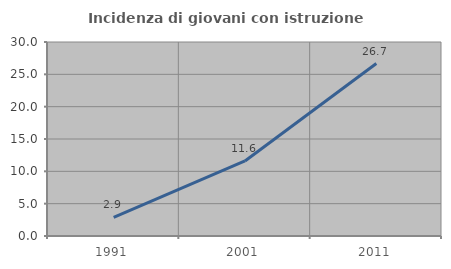
| Category | Incidenza di giovani con istruzione universitaria |
|---|---|
| 1991.0 | 2.883 |
| 2001.0 | 11.605 |
| 2011.0 | 26.667 |